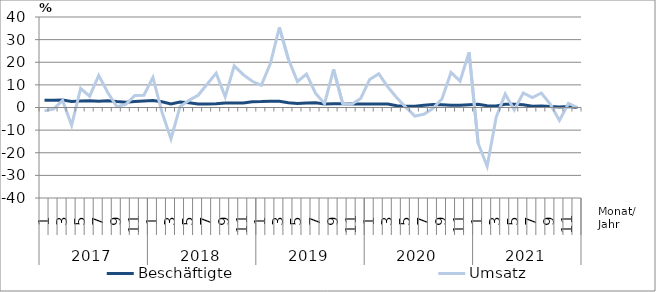
| Category | Beschäftigte | Umsatz |
|---|---|---|
| 0 | 3.2 | -1.5 |
| 1 | 3.2 | -0.7 |
| 2 | 3.3 | 3.1 |
| 3 | 2.7 | -7.9 |
| 4 | 2.9 | 8.4 |
| 5 | 3 | 5 |
| 6 | 2.8 | 14.2 |
| 7 | 3 | 6.6 |
| 8 | 2.6 | 0.4 |
| 9 | 2.3 | 1.4 |
| 10 | 2.7 | 5.3 |
| 11 | 2.9 | 5.4 |
| 12 | 3.1 | 13.3 |
| 13 | 2.5 | -2 |
| 14 | 1.6 | -13.9 |
| 15 | 2.4 | 0.4 |
| 16 | 2.1 | 3.2 |
| 17 | 1.6 | 5.4 |
| 18 | 1.5 | 10.3 |
| 19 | 1.7 | 15.2 |
| 20 | 2 | 4.7 |
| 21 | 2 | 18.4 |
| 22 | 2 | 14.5 |
| 23 | 2.5 | 11.6 |
| 24 | 2.6 | 9.8 |
| 25 | 2.8 | 19.4 |
| 26 | 2.8 | 35.4 |
| 27 | 2.1 | 21.3 |
| 28 | 1.8 | 11.5 |
| 29 | 2 | 14.8 |
| 30 | 2.1 | 6.3 |
| 31 | 1.6 | 1.7 |
| 32 | 1.7 | 16.9 |
| 33 | 1.7 | 1.8 |
| 34 | 1.6 | 1.4 |
| 35 | 1.5 | 4 |
| 36 | 1.6 | 12.4 |
| 37 | 1.6 | 14.9 |
| 38 | 1.5 | 9.1 |
| 39 | 0.8 | 4.3 |
| 40 | 0.6 | 0.1 |
| 41 | 0.6 | -3.8 |
| 42 | 1 | -3 |
| 43 | 1.3 | -0.4 |
| 44 | 1.2 | 3.8 |
| 45 | 1 | 15.5 |
| 46 | 1 | 11.7 |
| 47 | 1.2 | 24.4 |
| 48 | 1.4 | -15.8 |
| 49 | 0.8 | -26 |
| 50 | 0.7 | -4.3 |
| 51 | 1.4 | 6 |
| 52 | 1.4 | -1.1 |
| 53 | 1.2 | 6.4 |
| 54 | 0.6 | 4.4 |
| 55 | 0.7 | 6.4 |
| 56 | 0.4 | 1.4 |
| 57 | 0.2 | -5.7 |
| 58 | 0.4 | 1.8 |
| 59 | 0 | 0 |